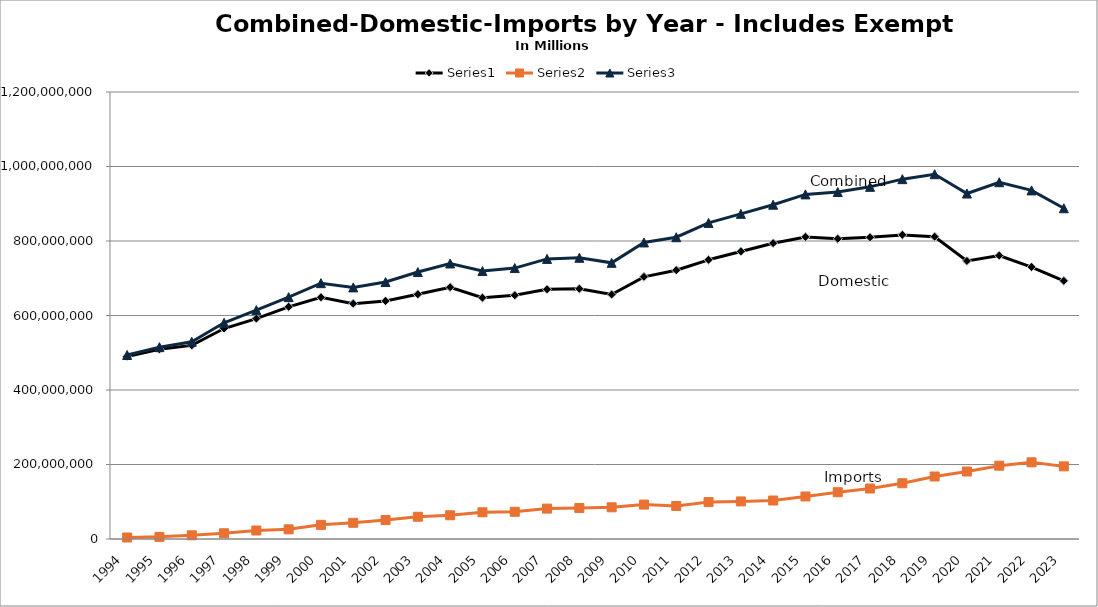
| Category | Series 0 | Series 1 | Series 2 |
|---|---|---|---|
| 1994 | 489900000 | 4060000 | 493960000 |
| 1995 | 509300000 | 5720000 | 515020000 |
| 1996 | 519730000 | 9940000 | 529670000 |
| 1997 | 564990000 | 15450000 | 580440000 |
| 1998 | 591710000 | 22840000 | 614550000 |
| 1999 | 623312000 | 25960000 | 649272000 |
| 2000 | 648775000 | 37995000 | 686770000 |
| 2001 | 631870000 | 43550000 | 675420000 |
| 2002 | 638880000 | 50899704.762 | 689779704.762 |
| 2003 | 656953556 | 59697493.887 | 716651049.887 |
| 2004 | 675963429 | 63676294.421 | 739639723.421 |
| 2005 | 647653438 | 71693357.114 | 719346795.114 |
| 2006 | 654295090.279 | 73029558.509 | 727324648.788 |
| 2007 | 670320908.747 | 81603702.512 | 751924611.259 |
| 2008 | 671760569.61 | 83183162 | 754943731.61 |
| 2009 | 656296449.81 | 85084570 | 741381019.81 |
| 2010 | 703716570.51 | 92390238 | 796106808.51 |
| 2011 | 721594535.57 | 88537774 | 810132309.57 |
| 2012 | 749479653 | 99126506 | 848606159 |
| 2013 | 771993455.99 | 100869339 | 872862794.99 |
| 2014 | 794087706.91 | 103307752 | 897395458.91 |
| 2015 | 810973172 | 114162606 | 925135778 |
| 2016 | 805942429.818 | 125562383 | 931504812.818 |
| 2017 | 809865466.727 | 135506544 | 945372010.727 |
| 2018 | 816374282.45 | 149687000 | 966061282.45 |
| 2019 | 811494774 | 167785373 | 979280147 |
| 2020 | 746300000 | 181160000 | 927460000 |
| 2021 | 760986000 | 196783000 | 957769000 |
| 2022 | 730056000 | 205809000 | 935865000 |
| 2023 | 692901000 | 194971000 | 887872000 |